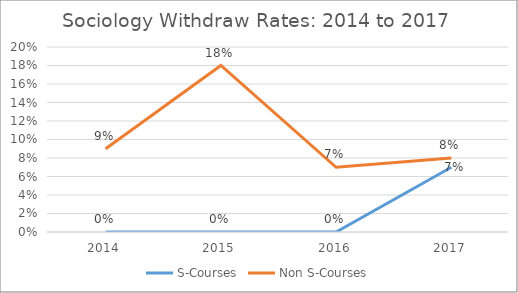
| Category | S-Courses | Non S-Courses |
|---|---|---|
| 2014.0 | 0 | 0.09 |
| 2015.0 | 0 | 0.18 |
| 2016.0 | 0 | 0.07 |
| 2017.0 | 0.07 | 0.08 |